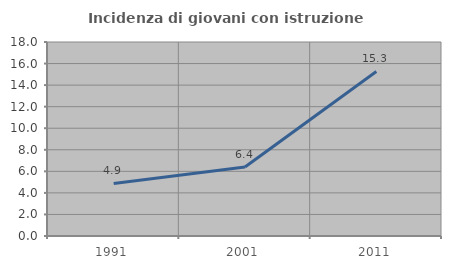
| Category | Incidenza di giovani con istruzione universitaria |
|---|---|
| 1991.0 | 4.872 |
| 2001.0 | 6.408 |
| 2011.0 | 15.266 |